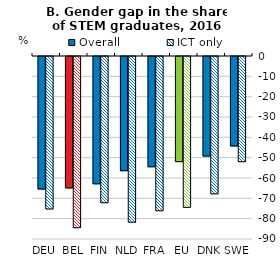
| Category | Overall | ICT only |
|---|---|---|
| DEU | -65.201 | -75 |
| BEL | -64.615 | -84.211 |
| FIN | -62.621 | -71.93 |
| NLD | -56.154 | -81.481 |
| FRA | -54.237 | -75.862 |
| EU | -51.705 | -74.194 |
| DNK | -48.993 | -67.568 |
| SWE | -44 | -51.724 |